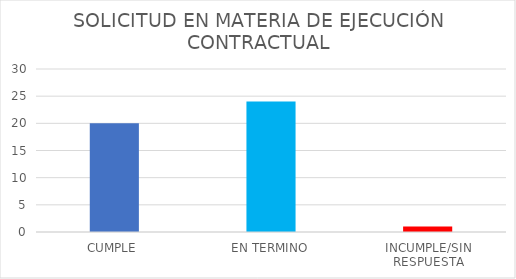
| Category | TOTAL |
|---|---|
| CUMPLE | 20 |
| EN TERMINO | 24 |
| INCUMPLE/SIN RESPUESTA | 1 |